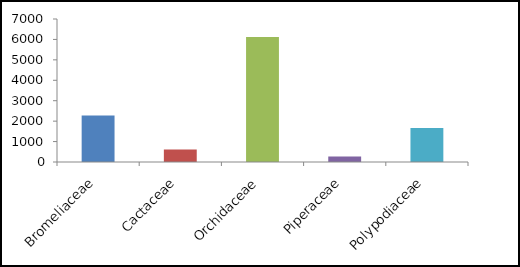
| Category | Quantidade |
|---|---|
| Bromeliaceae | 2280 |
| Cactaceae | 607 |
| Orchidaceae | 6113 |
| Piperaceae | 275 |
| Polypodiaceae | 1662 |